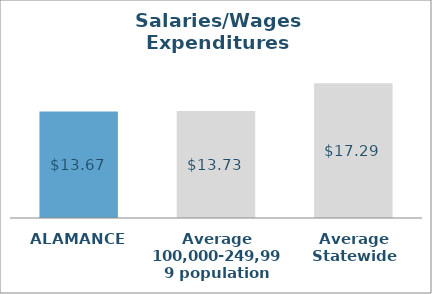
| Category | Series 0 |
|---|---|
| ALAMANCE | 13.669 |
| Average 100,000-249,999 population | 13.734 |
| Average Statewide | 17.285 |